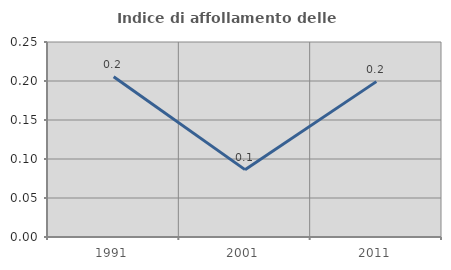
| Category | Indice di affollamento delle abitazioni  |
|---|---|
| 1991.0 | 0.206 |
| 2001.0 | 0.086 |
| 2011.0 | 0.199 |